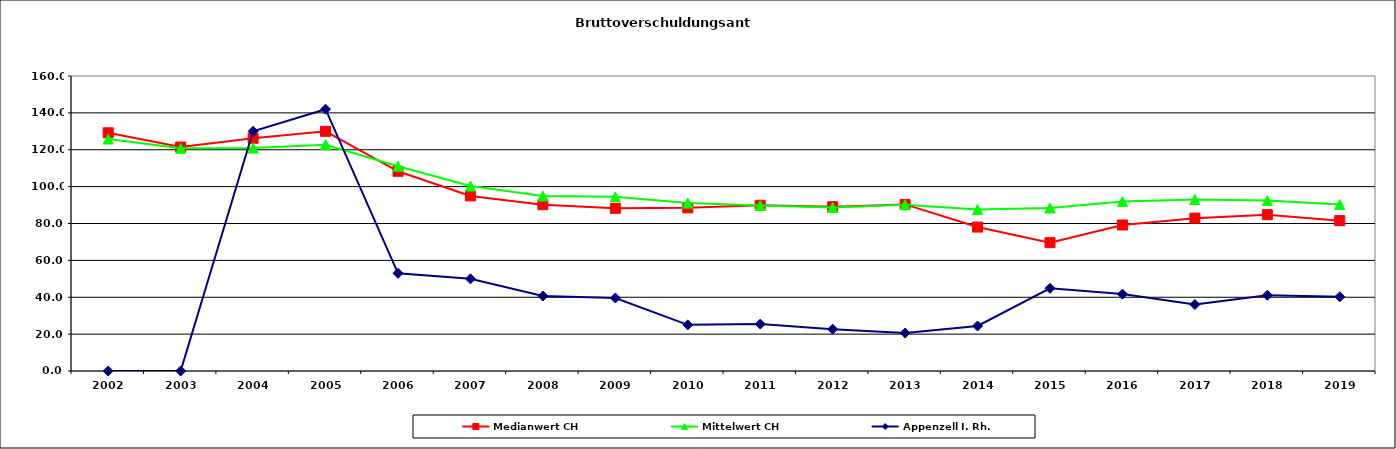
| Category | Medianwert CH | Mittelwert CH | Appenzell I. Rh. |
|---|---|---|---|
| 2002.0 | 129.2 | 125.8 | 0 |
| 2003.0 | 121.45 | 120.775 | 0 |
| 2004.0 | 126.25 | 120.889 | 130 |
| 2005.0 | 130 | 122.728 | 142 |
| 2006.0 | 108.3 | 111.087 | 53 |
| 2007.0 | 94.96 | 100.307 | 50 |
| 2008.0 | 90.2 | 94.911 | 40.67 |
| 2009.0 | 88.22 | 94.453 | 39.6 |
| 2010.0 | 88.5 | 91.058 | 25.05 |
| 2011.0 | 89.9 | 89.805 | 25.45 |
| 2012.0 | 89.11 | 88.689 | 22.68 |
| 2013.0 | 90.35 | 90.167 | 20.6 |
| 2014.0 | 78.06 | 87.587 | 24.41 |
| 2015.0 | 69.6 | 88.398 | 44.84 |
| 2016.0 | 79.2 | 91.977 | 41.7 |
| 2017.0 | 82.9 | 93.027 | 36.06 |
| 2018.0 | 84.8 | 92.448 | 41.11 |
| 2019.0 | 81.555 | 90.304 | 40.27 |